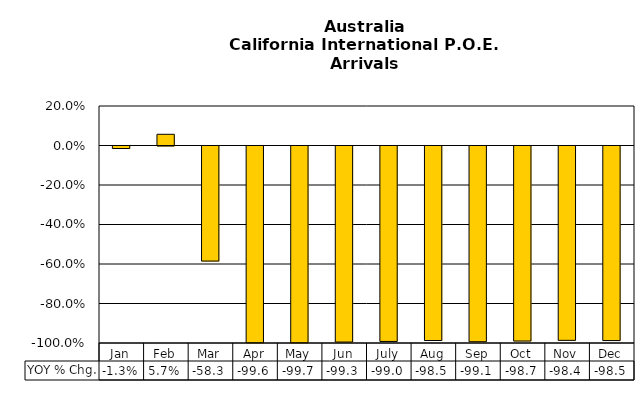
| Category | YOY % Chg. |
|---|---|
| Jan | -0.013 |
| Feb | 0.057 |
| Mar | -0.583 |
| Apr | -0.996 |
| May | -0.997 |
| Jun | -0.993 |
| July | -0.99 |
| Aug | -0.985 |
| Sep | -0.991 |
| Oct | -0.987 |
| Nov | -0.984 |
| Dec | -0.985 |